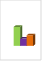
| Category | област Шумен |
|---|---|
| летен сезон 2019  | 31175 |
| летен сезон 2021  | 27977 |
| летен сезон 2022 г.  | 28880 |